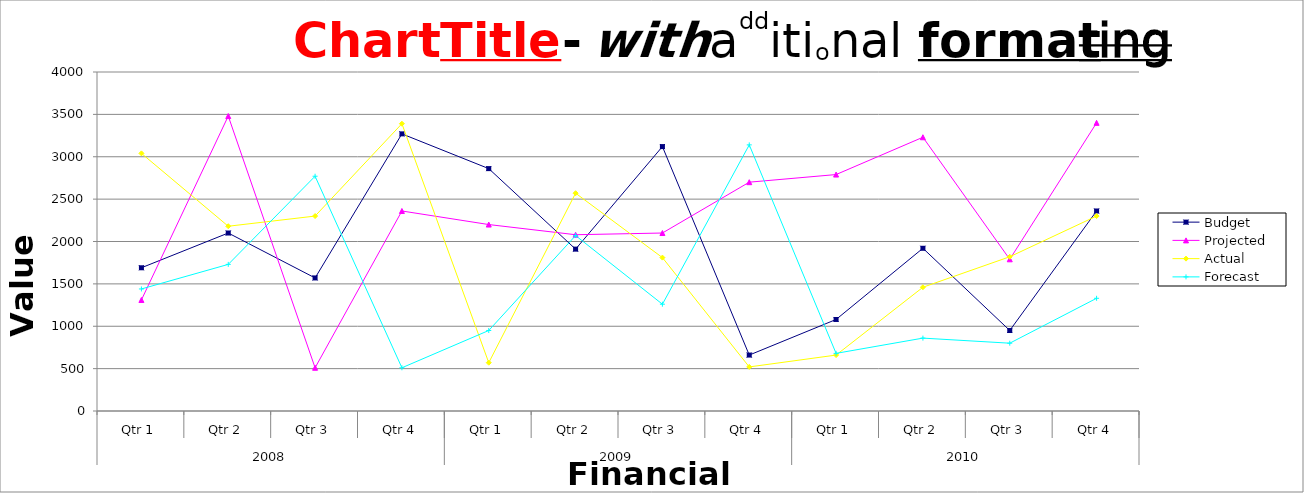
| Category | Budget | Projected | Actual | Forecast |
|---|---|---|---|---|
| 0 | 1690 | 1310 | 3040 | 1440 |
| 1 | 2100 | 3480 | 2180 | 1730 |
| 2 | 1570 | 510 | 2300 | 2770 |
| 3 | 3270 | 2360 | 3390 | 510 |
| 4 | 2860 | 2200 | 570 | 950 |
| 5 | 1910 | 2080 | 2570 | 2070 |
| 6 | 3120 | 2100 | 1810 | 1260 |
| 7 | 660 | 2700 | 520 | 3140 |
| 8 | 1080 | 2790 | 660 | 680 |
| 9 | 1920 | 3230 | 1460 | 860 |
| 10 | 950 | 1790 | 1820 | 800 |
| 11 | 2360 | 3400 | 2300 | 1330 |